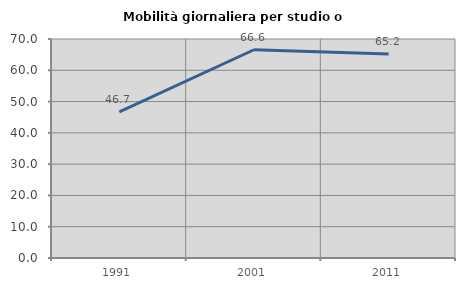
| Category | Mobilità giornaliera per studio o lavoro |
|---|---|
| 1991.0 | 46.681 |
| 2001.0 | 66.56 |
| 2011.0 | 65.229 |